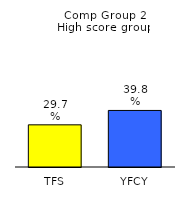
| Category | Series 0 |
|---|---|
| TFS | 0.297 |
| YFCY | 0.398 |